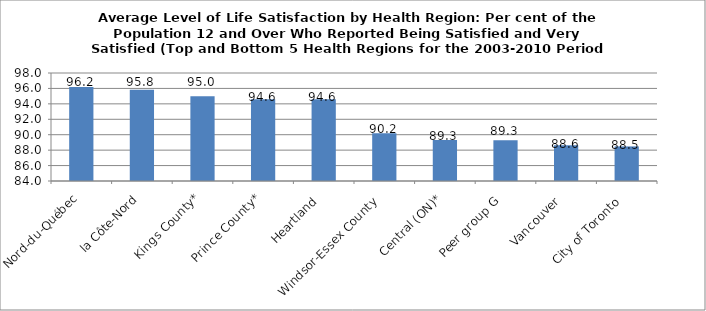
| Category | Average Level of Life Satisfaction by Health Region (per cent of the population 12 and over who reported being satisfied and very satisfied 2003, 2005, and 2007-2010) ( Top and Bottom 5)  |
|---|---|
| Nord-du-Québec | 96.183 |
| la Côte-Nord | 95.817 |
| Kings County* | 95 |
| Prince County* | 94.6 |
| Heartland  | 94.583 |
| Windsor-Essex County  | 90.183 |
| Central (ON)* | 89.325 |
| Peer group G  | 89.283 |
| Vancouver  | 88.633 |
| City of Toronto  | 88.483 |